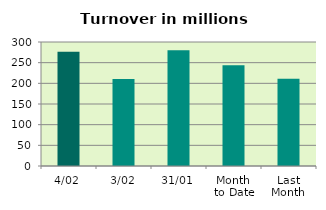
| Category | Series 0 |
|---|---|
| 4/02 | 276.647 |
| 3/02 | 210.333 |
| 31/01 | 280.01 |
| Month 
to Date | 243.49 |
| Last
Month | 211.344 |